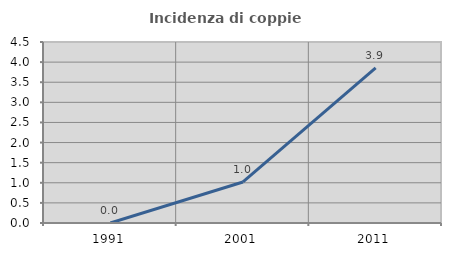
| Category | Incidenza di coppie miste |
|---|---|
| 1991.0 | 0 |
| 2001.0 | 1.02 |
| 2011.0 | 3.854 |